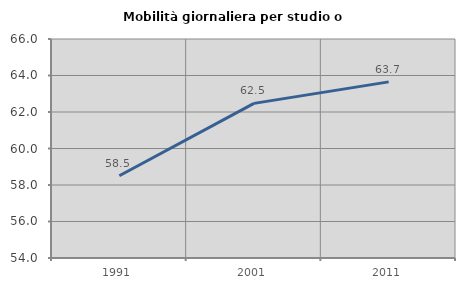
| Category | Mobilità giornaliera per studio o lavoro |
|---|---|
| 1991.0 | 58.504 |
| 2001.0 | 62.472 |
| 2011.0 | 63.651 |